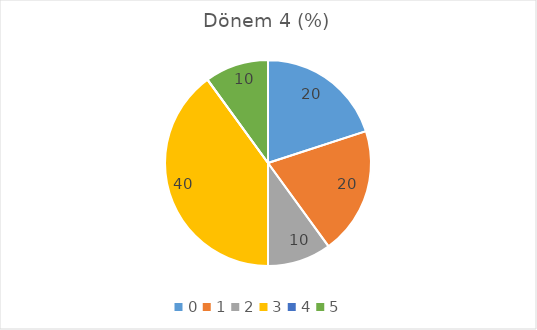
| Category | Dönem 4 (%) |
|---|---|
| 0.0 | 20 |
| 1.0 | 20 |
| 2.0 | 10 |
| 3.0 | 40 |
| 4.0 | 0 |
| 5.0 | 10 |